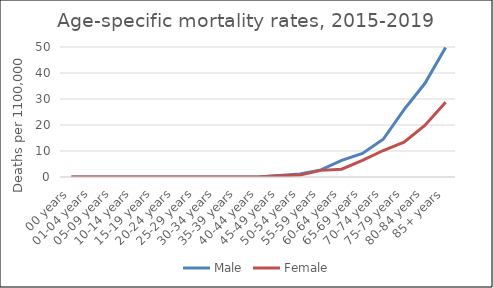
| Category | Male | Female |
|---|---|---|
| 00 years | 0 | 0 |
| 01-04 years | 0 | 0 |
| 05-09 years | 0 | 0 |
| 10-14 years | 0 | 0 |
| 15-19 years | 0 | 0 |
| 20-24 years | 0 | 0 |
| 25-29 years | 0 | 0 |
| 30-34 years | 0 | 0 |
| 35-39 years | 0 | 0 |
| 40-44 years | 0 | 0 |
| 45-49 years | 0.54 | 0.47 |
| 50-54 years | 1.2 | 0.81 |
| 55-59 years | 2.75 | 2.55 |
| 60-64 years | 6.37 | 3.01 |
| 65-69 years | 9.08 | 6.37 |
| 70-74 years | 14.51 | 10.19 |
| 75-79 years | 25.94 | 13.43 |
| 80-84 years | 35.94 | 19.83 |
| 85+ years | 49.81 | 28.71 |